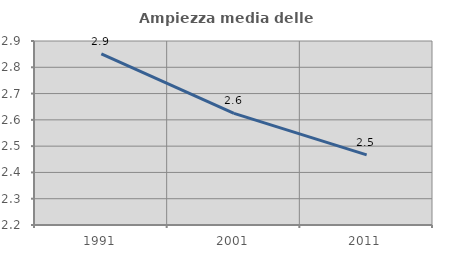
| Category | Ampiezza media delle famiglie |
|---|---|
| 1991.0 | 2.851 |
| 2001.0 | 2.625 |
| 2011.0 | 2.467 |